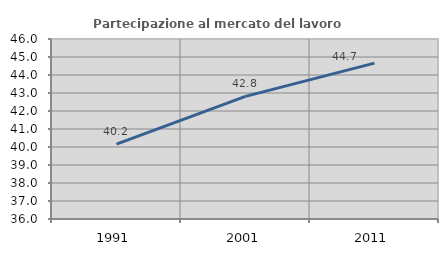
| Category | Partecipazione al mercato del lavoro  femminile |
|---|---|
| 1991.0 | 40.157 |
| 2001.0 | 42.812 |
| 2011.0 | 44.66 |